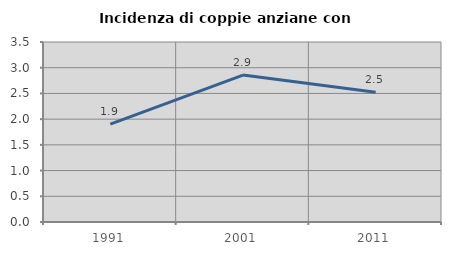
| Category | Incidenza di coppie anziane con figli |
|---|---|
| 1991.0 | 1.905 |
| 2001.0 | 2.857 |
| 2011.0 | 2.521 |